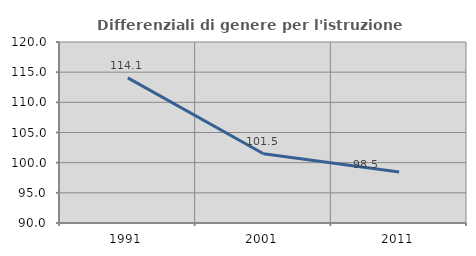
| Category | Differenziali di genere per l'istruzione superiore |
|---|---|
| 1991.0 | 114.051 |
| 2001.0 | 101.48 |
| 2011.0 | 98.459 |